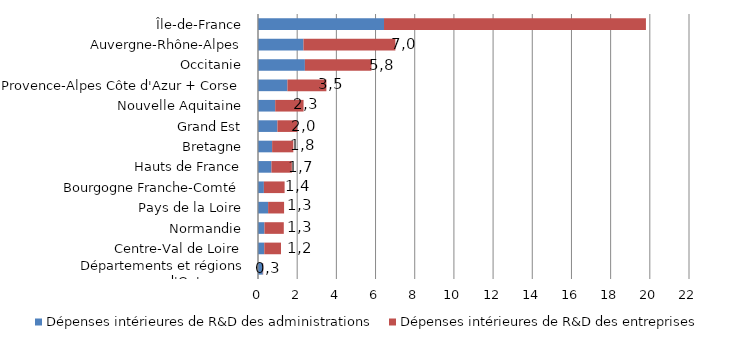
| Category | Dépenses intérieures de R&D des administrations | Dépenses intérieures de R&D des entreprises |
|---|---|---|
| Départements et régions d'Outre-mer | 244.121 | 20.619 |
| Centre-Val de Loire | 320.554 | 852.15 |
| Normandie | 328.961 | 987.608 |
| Pays de la Loire | 516.106 | 814.947 |
| Bourgogne Franche-Comté | 300.804 | 1057.703 |
| Hauts de France | 686.282 | 1040.642 |
| Bretagne | 720.923 | 1082.003 |
| Grand Est | 992.381 | 1009.107 |
| Nouvelle Aquitaine | 878.219 | 1447.825 |
| Provence-Alpes Côte d'Azur + Corse | 1503.332 | 1987.032 |
| Occitanie | 2393.774 | 3396.534 |
| Auvergne-Rhône-Alpes | 2321.065 | 4690.66 |
| Île-de-France | 6432.173 | 13369.55 |